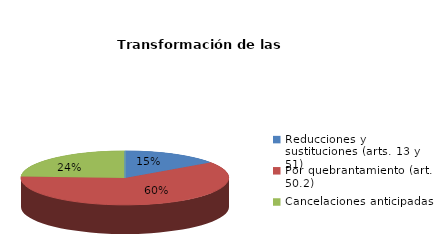
| Category | Series 0 |
|---|---|
| Reducciones y sustituciones (arts. 13 y 51) | 19 |
| Por quebrantamiento (art. 50.2) | 75 |
| Cancelaciones anticipadas | 30 |
| Traslado a Centros Penitenciarios | 0 |
| Conversión internamientos en cerrados (art. 51.2) | 0 |